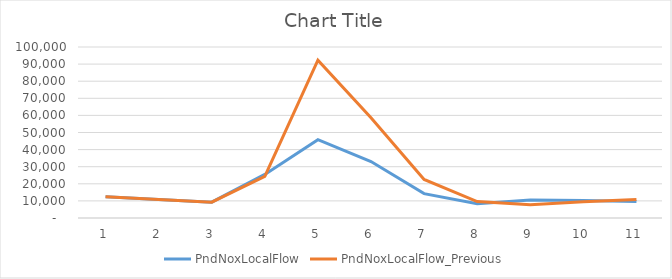
| Category | PndNoxLocalFlow | PndNoxLocalFlow_Previous |
|---|---|---|
| 0 | 12390.86 | 12362.258 |
| 1 | 10782.07 | 10751.143 |
| 2 | 9258.63 | 9261.742 |
| 3 | 25505.5 | 24375.133 |
| 4 | 45787.89 | 92261.161 |
| 5 | 33001.78 | 58596.633 |
| 6 | 14247.93 | 22550.226 |
| 7 | 8350.75 | 9618.839 |
| 8 | 10506.63 | 7727.633 |
| 9 | 10247.85 | 9523.645 |
| 10 | 9650.46 | 10772.067 |